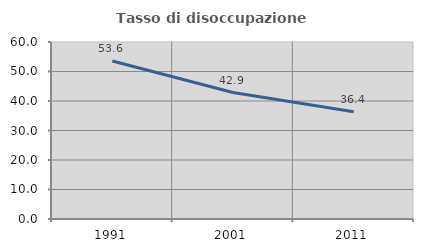
| Category | Tasso di disoccupazione giovanile  |
|---|---|
| 1991.0 | 53.571 |
| 2001.0 | 42.857 |
| 2011.0 | 36.364 |